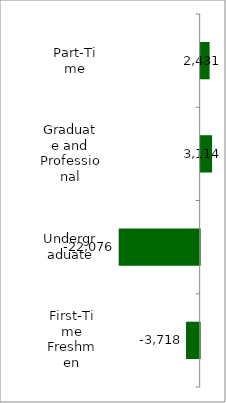
| Category | 50 states and D.C. |
|---|---|
| First-Time Freshmen | -3718 |
| Undergraduate | -22076 |
| Graduate and Professional | 3114 |
| Part-Time | 2431 |